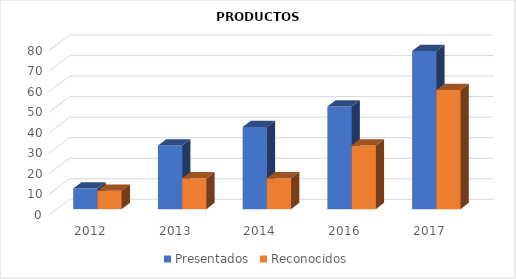
| Category | Presentados | Reconocidos |
|---|---|---|
| 2012.0 | 10 | 9 |
| 2013.0 | 31 | 15 |
| 2014.0 | 40 | 15 |
| 2016.0 | 50 | 31 |
| 2017.0 | 77 | 58 |